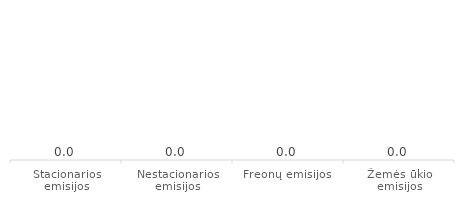
| Category | Series 0 |
|---|---|
| Stacionarios emisijos | 0 |
| Nestacionarios emisijos | 0 |
| Freonų emisijos | 0 |
| Žemės ūkio emisijos | 0 |